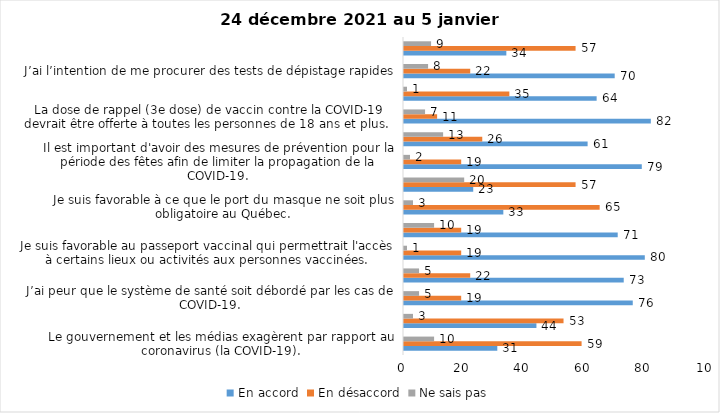
| Category | En accord | En désaccord | Ne sais pas |
|---|---|---|---|
| Le gouvernement et les médias exagèrent par rapport au coronavirus (la COVID-19). | 31 | 59 | 10 |
| Je suis favorable à la mise en place d’un couvre-feu. | 44 | 53 | 3 |
| J’ai peur que le système de santé soit débordé par les cas de COVID-19. | 76 | 19 | 5 |
| Je suis inquiet/inquiète que le nombre de cas augmente en raison des nouveaux variants du virus de la COVID-19. | 73 | 22 | 5 |
| Je suis favorable au passeport vaccinal qui permettrait l'accès à certains lieux ou activités aux personnes vaccinées. | 80 | 19 | 1 |
| Je suis confiant que la vaccination protège efficacement contre les variants de la COVID-19 | 71 | 19 | 10 |
| Je suis favorable à ce que le port du masque ne soit plus obligatoire au Québec. | 33 | 65 | 3 |
| La vaccination des enfants entre 5 et 11 ans mettra fin à la pandémie. | 23 | 57 | 20 |
| Il est important d'avoir des mesures de prévention pour la période des fêtes afin de limiter la propagation de la COVID-19. | 79 | 19 | 2 |
| La pandémie ne sera pas terminée au Québec avant que tous les habitants de la terre puissent être vaccinés contre la COVID-19.   | 61 | 26 | 13 |
| La dose de rappel (3e dose) de vaccin contre la COVID-19 devrait être offerte à toutes les personnes de 18 ans et plus.  | 82 | 11 | 7 |
| Je suis inconfortable d’être en contact avec une personne non vaccinée contre la COVID-19 | 64 | 35 | 1 |
| J’ai l’intention de me procurer des tests de dépistage rapides | 70 | 22 | 8 |
| Je n'ai pas peur du variant Omicron, car il semble moins dangereux pour la santé. | 34 | 57 | 9 |